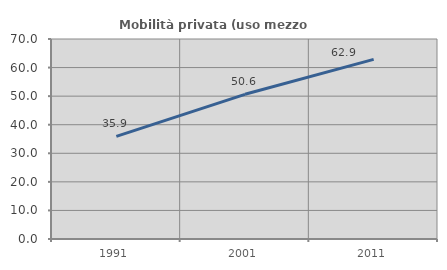
| Category | Mobilità privata (uso mezzo privato) |
|---|---|
| 1991.0 | 35.903 |
| 2001.0 | 50.639 |
| 2011.0 | 62.876 |